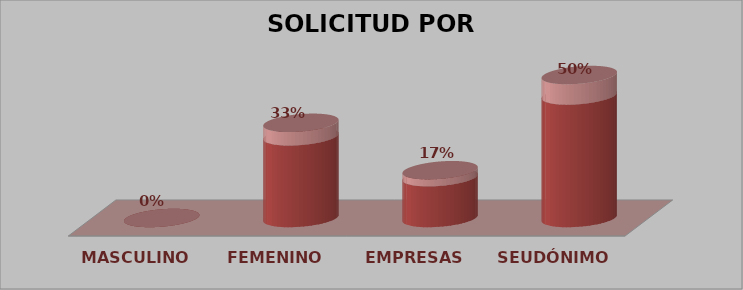
| Category | SOLICITUD POR GÉNERO | Series 1 |
|---|---|---|
| MASCULINO | 0 | 0 |
| FEMENINO | 2 | 0.33 |
| EMPRESAS | 1 | 0.17 |
| SEUDÓNIMO | 3 | 0.5 |